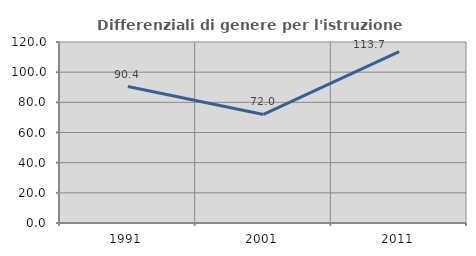
| Category | Differenziali di genere per l'istruzione superiore |
|---|---|
| 1991.0 | 90.436 |
| 2001.0 | 71.953 |
| 2011.0 | 113.692 |